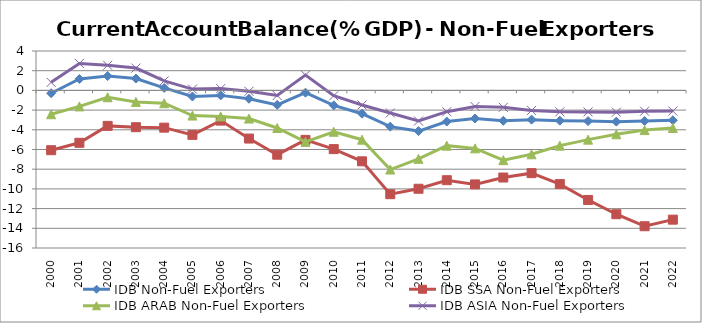
| Category | IDB Non-Fuel Exporters | IDB SSA Non-Fuel Exporters | IDB ARAB Non-Fuel Exporters | IDB ASIA Non-Fuel Exporters |
|---|---|---|---|---|
| 2000.0 | -0.288 | -6.072 | -2.42 | 0.816 |
| 2001.0 | 1.163 | -5.321 | -1.628 | 2.735 |
| 2002.0 | 1.455 | -3.602 | -0.698 | 2.551 |
| 2003.0 | 1.204 | -3.735 | -1.166 | 2.267 |
| 2004.0 | 0.252 | -3.781 | -1.301 | 0.967 |
| 2005.0 | -0.62 | -4.515 | -2.555 | 0.133 |
| 2006.0 | -0.506 | -3.066 | -2.64 | 0.181 |
| 2007.0 | -0.848 | -4.889 | -2.858 | -0.092 |
| 2008.0 | -1.466 | -6.527 | -3.818 | -0.519 |
| 2009.0 | -0.235 | -5.027 | -5.23 | 1.549 |
| 2010.0 | -1.524 | -5.96 | -4.199 | -0.542 |
| 2011.0 | -2.364 | -7.201 | -5.004 | -1.485 |
| 2012.0 | -3.679 | -10.537 | -8.036 | -2.289 |
| 2013.0 | -4.131 | -9.985 | -6.949 | -3.108 |
| 2014.0 | -3.162 | -9.117 | -5.609 | -2.161 |
| 2015.0 | -2.852 | -9.545 | -5.884 | -1.634 |
| 2016.0 | -3.084 | -8.846 | -7.083 | -1.716 |
| 2017.0 | -2.969 | -8.401 | -6.487 | -2.032 |
| 2018.0 | -3.072 | -9.511 | -5.607 | -2.177 |
| 2019.0 | -3.116 | -11.123 | -4.998 | -2.184 |
| 2020.0 | -3.172 | -12.571 | -4.456 | -2.212 |
| 2021.0 | -3.109 | -13.789 | -4.03 | -2.111 |
| 2022.0 | -3.032 | -13.122 | -3.815 | -2.099 |